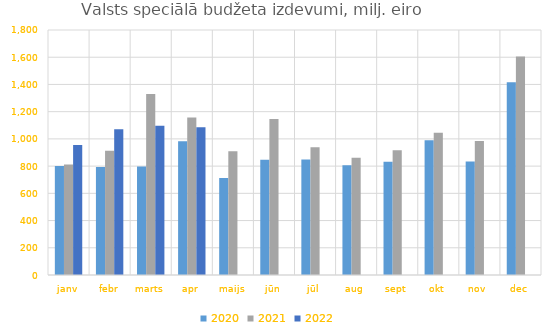
| Category | 2020 | 2021 | 2022 |
|---|---|---|---|
| janv | 800513.176 | 812540.784 | 954604.585 |
| febr | 793560.967 | 913452.191 | 1070533.109 |
| marts | 796946.618 | 1329058.335 | 1096177.665 |
| apr | 981781.839 | 1156902.965 | 1085060.388 |
| maijs | 711775.073 | 909621.75 | 0 |
| jūn | 846260.327 | 1146703.878 | 0 |
| jūl | 848728.248 | 939467.851 | 0 |
| aug | 805848.679 | 860719.856 | 0 |
| sept | 832590.985 | 915890.517 | 0 |
| okt | 990572.907 | 1045656.477 | 0 |
| nov | 834311.145 | 984919.983 | 0 |
| dec | 1416800.012 | 1605011.589 | 0 |